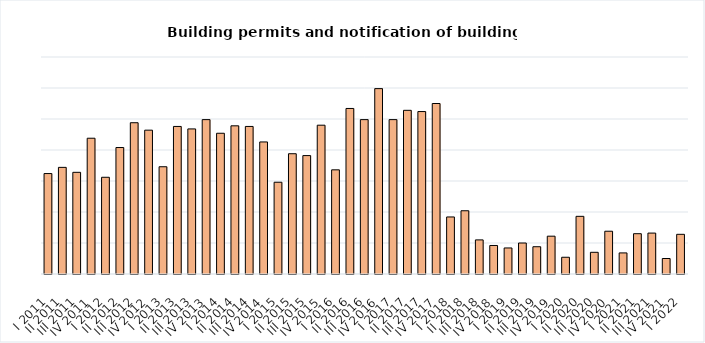
| Category | Building permits and notification of building work |
|---|---|
| I 2011 | 162 |
| II 2011 | 172 |
| III 2011 | 164 |
| IV 2011 | 219 |
| I 2012 | 156 |
| II 2012 | 204 |
| III 2012 | 244 |
| IV 2012 | 232 |
| I 2013 | 173 |
| II 2013 | 238 |
| III 2013 | 234 |
| IV 2013 | 249 |
| I 2014 | 227 |
| II 2014 | 239 |
| III 2014 | 238 |
| IV 2014 | 213 |
| I 2015 | 148 |
| II 2015 | 194 |
| III 2015 | 191 |
| IV 2015 | 240 |
| I 2016 | 168 |
| II 2016 | 267 |
| III 2016 | 249 |
| IV 2016 | 299 |
| I 2017 | 249 |
| II 2017 | 264 |
| III 2017 | 262 |
| IV 2017 | 275 |
| I 2018 | 92 |
| II 2018 | 102 |
| III 2018 | 55 |
| IV 2018 | 46 |
| I 2019 | 42 |
| II 2019 | 50 |
| III 2019 | 44 |
| IV 2019 | 61 |
| I 2020 | 27 |
| II 2020 | 93 |
| III 2020 | 35 |
| IV 2020 | 69 |
| I 2021 | 34 |
| II 2021 | 65 |
| III 2021 | 66 |
| IV 2021 | 25 |
| I 2022 | 64 |